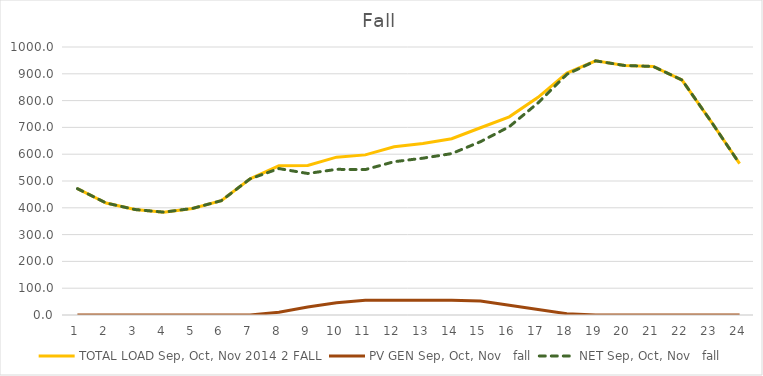
| Category | TOTAL LOAD | PV GEN | NET |
|---|---|---|---|
| 0 | 471.452 | 0 | 471.452 |
| 1 | 417.757 | 0 | 417.757 |
| 2 | 393.552 | 0 | 393.552 |
| 3 | 383.798 | 0 | 383.798 |
| 4 | 397.756 | 0 | 397.756 |
| 5 | 426.598 | 0 | 426.598 |
| 6 | 508.196 | 0.03 | 508.166 |
| 7 | 556.564 | 10.157 | 546.407 |
| 8 | 558.216 | 30.206 | 528.009 |
| 9 | 589.015 | 45.498 | 543.516 |
| 10 | 597.477 | 54.905 | 542.572 |
| 11 | 627.453 | 55.458 | 571.996 |
| 12 | 639.668 | 54.59 | 585.078 |
| 13 | 657.746 | 55.481 | 602.265 |
| 14 | 698.665 | 51.949 | 646.716 |
| 15 | 739.372 | 36.766 | 702.606 |
| 16 | 812.253 | 20.719 | 791.534 |
| 17 | 902.858 | 4.735 | 898.123 |
| 18 | 948.354 | 0.007 | 948.347 |
| 19 | 931.019 | 0 | 931.019 |
| 20 | 927.461 | 0 | 927.461 |
| 21 | 876.739 | 0 | 876.739 |
| 22 | 723.527 | 0 | 723.527 |
| 23 | 564.543 | 0 | 564.543 |